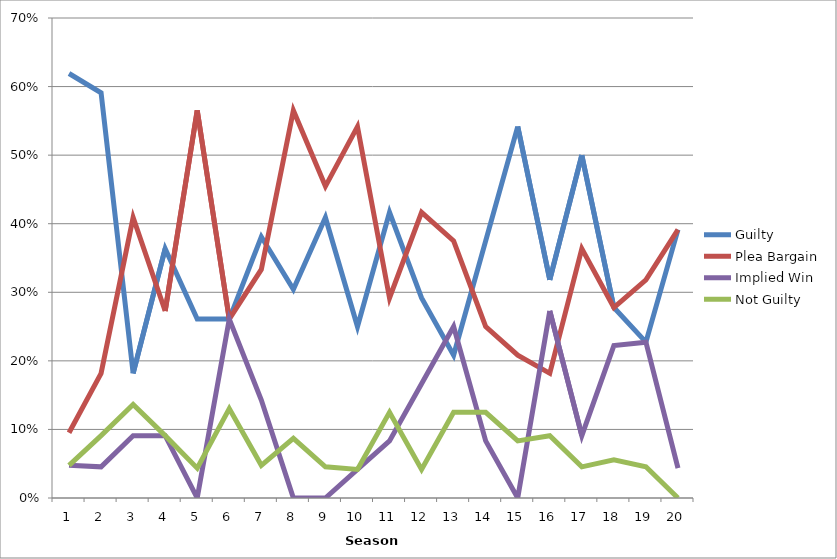
| Category | Guilty | Plea Bargain | Implied Win | Not Guilty |
|---|---|---|---|---|
| 1.0 | 0.619 | 0.095 | 0.048 | 0.048 |
| 2.0 | 0.591 | 0.182 | 0.045 | 0.091 |
| 3.0 | 0.182 | 0.409 | 0.091 | 0.136 |
| 4.0 | 0.364 | 0.273 | 0.091 | 0.091 |
| 5.0 | 0.261 | 0.565 | 0 | 0.043 |
| 6.0 | 0.261 | 0.261 | 0.261 | 0.13 |
| 7.0 | 0.381 | 0.333 | 0.143 | 0.048 |
| 8.0 | 0.304 | 0.565 | 0 | 0.087 |
| 9.0 | 0.409 | 0.455 | 0 | 0.045 |
| 10.0 | 0.25 | 0.542 | 0.042 | 0.042 |
| 11.0 | 0.417 | 0.292 | 0.083 | 0.125 |
| 12.0 | 0.292 | 0.417 | 0.167 | 0.042 |
| 13.0 | 0.208 | 0.375 | 0.25 | 0.125 |
| 14.0 | 0.375 | 0.25 | 0.083 | 0.125 |
| 15.0 | 0.542 | 0.208 | 0 | 0.083 |
| 16.0 | 0.318 | 0.182 | 0.273 | 0.091 |
| 17.0 | 0.5 | 0.364 | 0.091 | 0.045 |
| 18.0 | 0.278 | 0.278 | 0.222 | 0.056 |
| 19.0 | 0.227 | 0.318 | 0.227 | 0.045 |
| 20.0 | 0.391 | 0.391 | 0.043 | 0 |